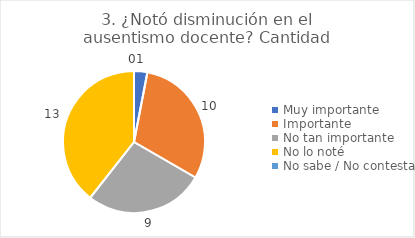
| Category | 3. ¿Notó disminución en el ausentismo docente? |
|---|---|
| Muy importante  | 0.03 |
| Importante  | 0.303 |
| No tan importante  | 0.273 |
| No lo noté  | 0.394 |
| No sabe / No contesta | 0 |